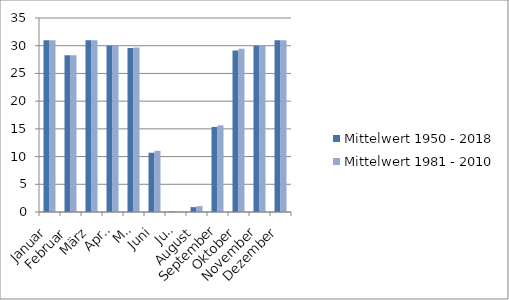
| Category | Mittelwert 1950 - 2018 | Mittelwert 1981 - 2010 |
|---|---|---|
| Januar | 31 | 31 |
| Februar | 28.261 | 28.267 |
| März | 31 | 31 |
| April | 30 | 30 |
| Mai | 29.609 | 29.667 |
| Juni | 10.696 | 11.033 |
| Juli | 0.072 | 0.033 |
| August | 0.884 | 1.067 |
| September | 15.348 | 15.633 |
| Oktober | 29.145 | 29.467 |
| November | 30 | 30 |
| Dezember | 31 | 31 |